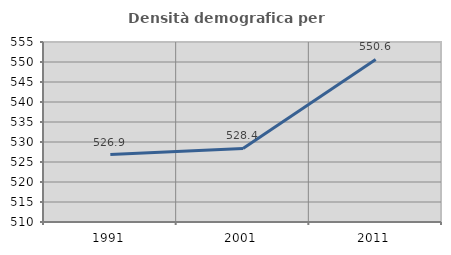
| Category | Densità demografica |
|---|---|
| 1991.0 | 526.863 |
| 2001.0 | 528.394 |
| 2011.0 | 550.635 |